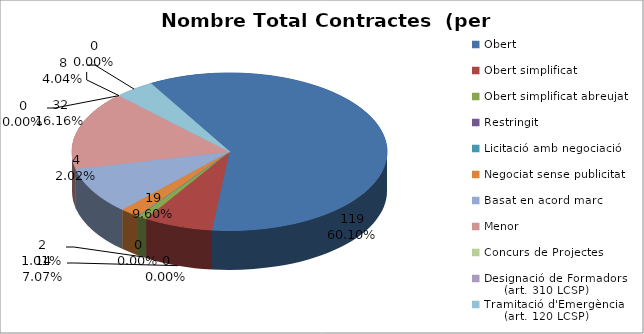
| Category | Nombre Total Contractes |
|---|---|
| Obert | 119 |
| Obert simplificat | 14 |
| Obert simplificat abreujat | 2 |
| Restringit | 0 |
| Licitació amb negociació | 0 |
| Negociat sense publicitat | 4 |
| Basat en acord marc | 19 |
| Menor | 32 |
| Concurs de Projectes | 0 |
| Designació de Formadors
     (art. 310 LCSP) | 0 |
| Tramitació d'Emergència
     (art. 120 LCSP) | 8 |